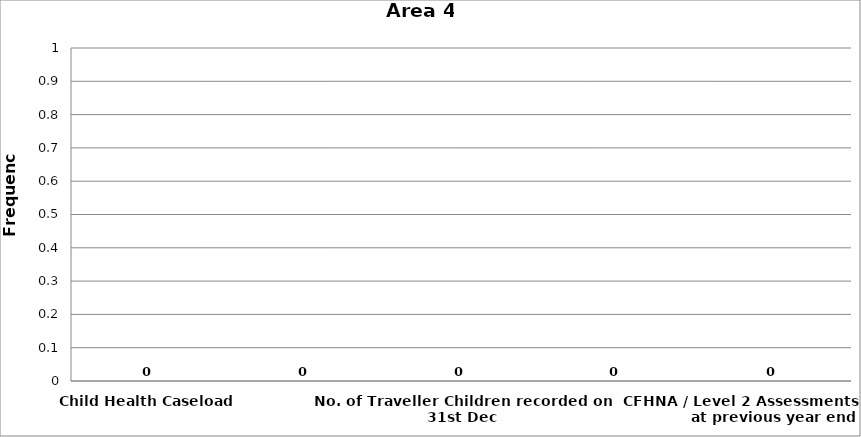
| Category | Area 4 |
|---|---|
| Child Health Caseload | 0 |
| No. of Roma Children recorded on 31st Dec | 0 |
| No. of Traveller Children recorded on 31st Dec | 0 |
| Homeless Children recorded on 31st Dec | 0 |
| CFHNA / Level 2 Assessments in place at previous year end | 0 |